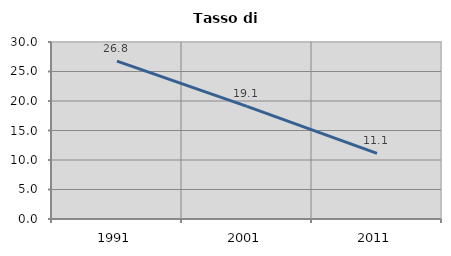
| Category | Tasso di disoccupazione   |
|---|---|
| 1991.0 | 26.765 |
| 2001.0 | 19.08 |
| 2011.0 | 11.137 |